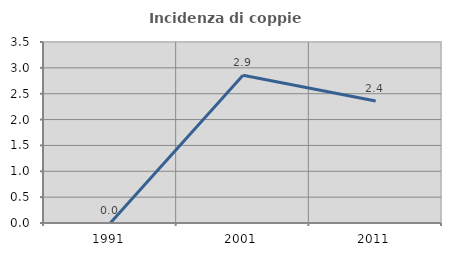
| Category | Incidenza di coppie miste |
|---|---|
| 1991.0 | 0 |
| 2001.0 | 2.857 |
| 2011.0 | 2.36 |